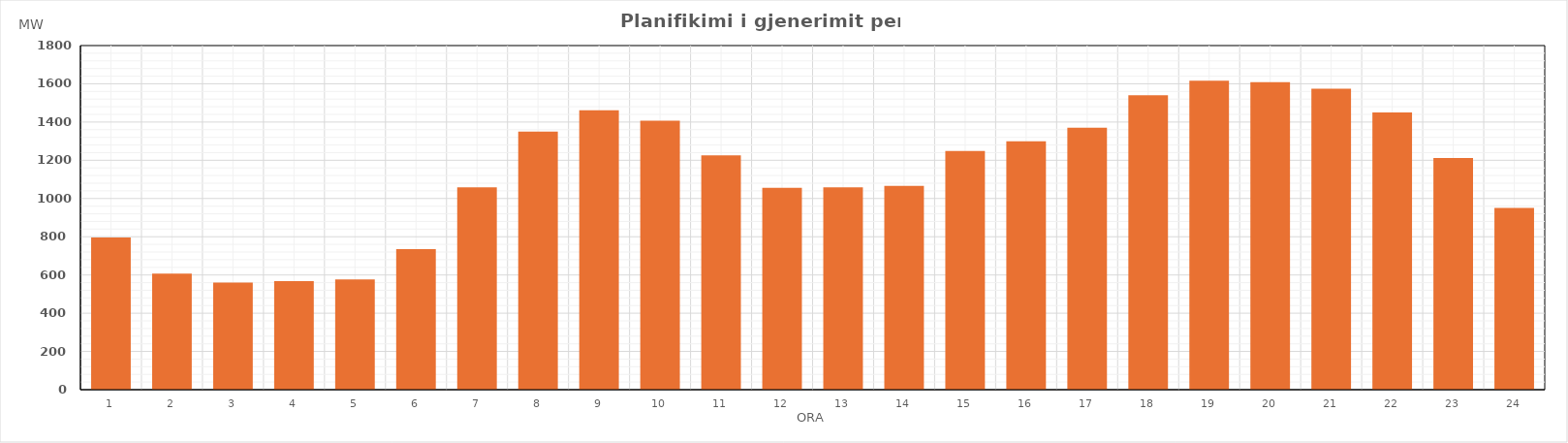
| Category | Max (MW) |
|---|---|
| 0 | 796.45 |
| 1 | 607.37 |
| 2 | 560.56 |
| 3 | 567.35 |
| 4 | 576.45 |
| 5 | 735.06 |
| 6 | 1058.69 |
| 7 | 1349.77 |
| 8 | 1461.93 |
| 9 | 1407.59 |
| 10 | 1225.91 |
| 11 | 1055.87 |
| 12 | 1058.79 |
| 13 | 1066.66 |
| 14 | 1248.69 |
| 15 | 1299.14 |
| 16 | 1370.13 |
| 17 | 1540.68 |
| 18 | 1616.71 |
| 19 | 1609.22 |
| 20 | 1574.83 |
| 21 | 1450.04 |
| 22 | 1211.95 |
| 23 | 950.44 |